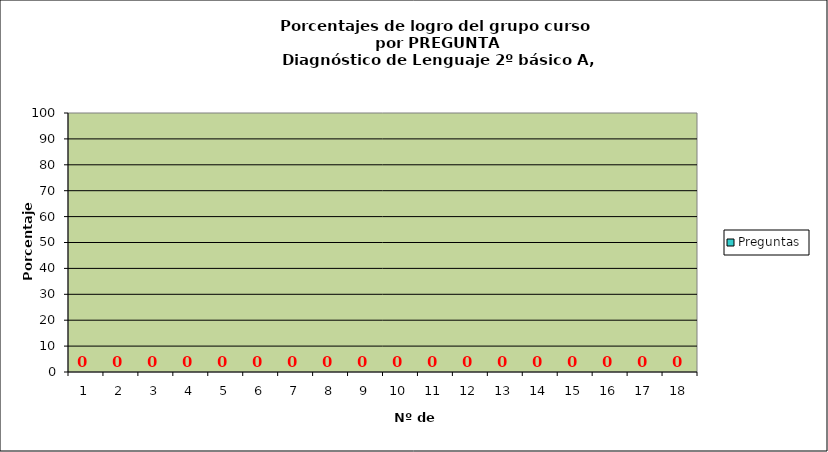
| Category | Preguntas |
|---|---|
| 0 | 0 |
| 1 | 0 |
| 2 | 0 |
| 3 | 0 |
| 4 | 0 |
| 5 | 0 |
| 6 | 0 |
| 7 | 0 |
| 8 | 0 |
| 9 | 0 |
| 10 | 0 |
| 11 | 0 |
| 12 | 0 |
| 13 | 0 |
| 14 | 0 |
| 15 | 0 |
| 16 | 0 |
| 17 | 0 |